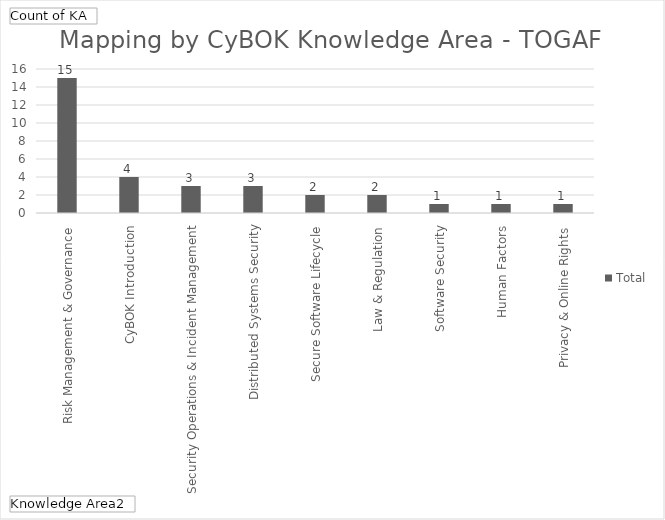
| Category | Total |
|---|---|
| Risk Management & Governance | 15 |
| CyBOK Introduction | 4 |
| Security Operations & Incident Management | 3 |
| Distributed Systems Security | 3 |
| Secure Software Lifecycle | 2 |
| Law & Regulation | 2 |
| Software Security | 1 |
| Human Factors | 1 |
| Privacy & Online Rights | 1 |